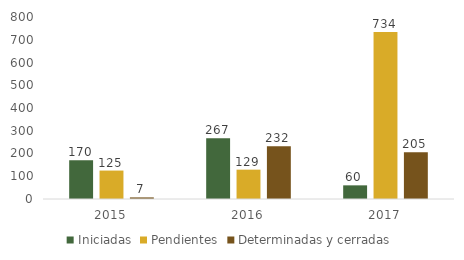
| Category | Iniciadas | Pendientes | Determinadas y cerradas |
|---|---|---|---|
| 2015.0 | 170 | 125 | 7 |
| 2016.0 | 267 | 129 | 232 |
| 2017.0 | 60 | 734 | 205 |